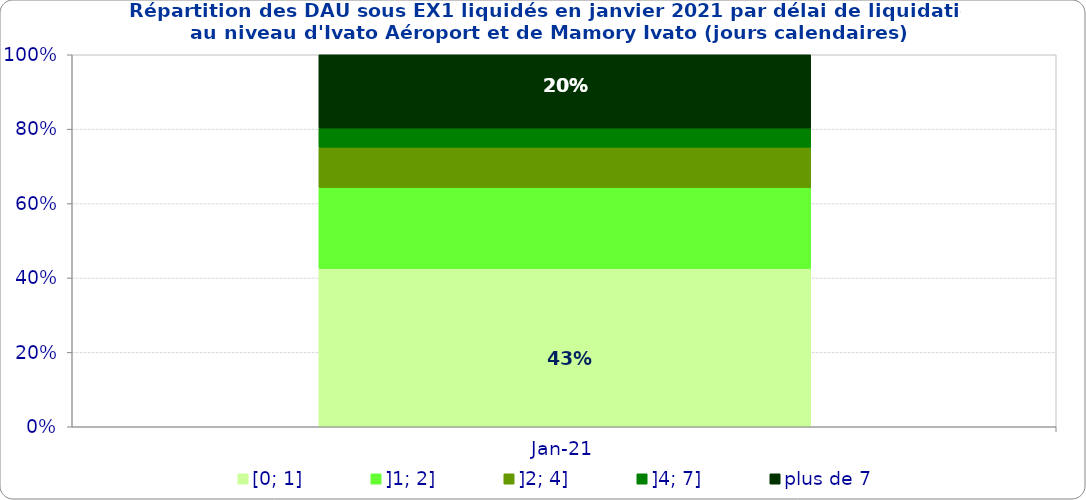
| Category | [0; 1] | ]1; 2] | ]2; 4] | ]4; 7] | plus de 7 |
|---|---|---|---|---|---|
| 2021-01-01 | 0.426 | 0.217 | 0.109 | 0.051 | 0.197 |